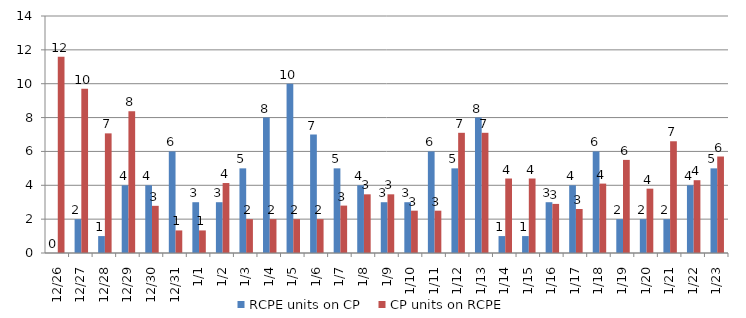
| Category | RCPE units on CP | CP units on RCPE |
|---|---|---|
| 2015-12-26 | 0 | 11.6 |
| 2015-12-27 | 2 | 9.7 |
| 2015-12-28 | 1 | 7.067 |
| 2015-12-29 | 4 | 8.367 |
| 2015-12-30 | 4 | 2.787 |
| 2015-12-31 | 6 | 1.333 |
| 2016-01-01 | 3 | 1.333 |
| 2016-01-02 | 3 | 4.133 |
| 2016-01-03 | 5 | 2 |
| 2016-01-04 | 8 | 2 |
| 2016-01-05 | 10 | 2 |
| 2016-01-06 | 7 | 2 |
| 2016-01-07 | 5 | 2.8 |
| 2016-01-08 | 4 | 3.467 |
| 2016-01-09 | 3 | 3.467 |
| 2016-01-10 | 3 | 2.5 |
| 2016-01-11 | 6 | 2.5 |
| 2016-01-12 | 5 | 7.1 |
| 2016-01-13 | 8 | 7.1 |
| 2016-01-14 | 1 | 4.4 |
| 2016-01-15 | 1 | 4.4 |
| 2016-01-16 | 3 | 2.9 |
| 2016-01-17 | 4 | 2.6 |
| 2016-01-18 | 6 | 4.1 |
| 2016-01-19 | 2 | 5.5 |
| 2016-01-20 | 2 | 3.8 |
| 2016-01-21 | 2 | 6.6 |
| 2016-01-22 | 4 | 4.3 |
| 2016-01-23 | 5 | 5.7 |